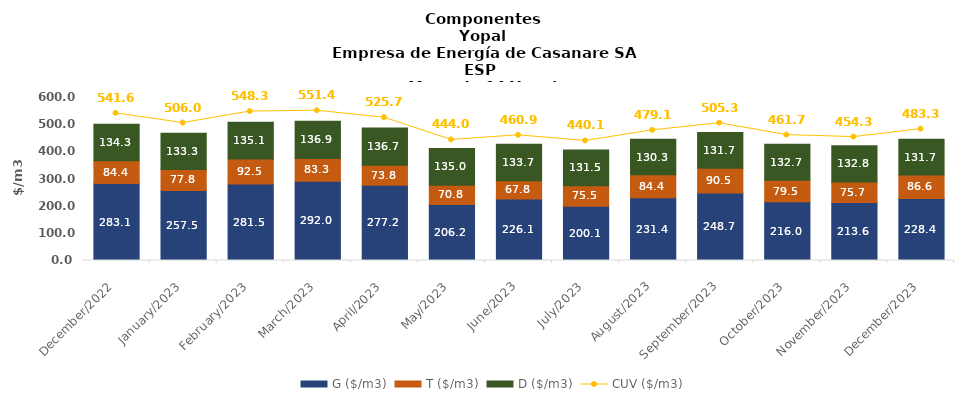
| Category | G ($/m3) | T ($/m3) | D ($/m3) |
|---|---|---|---|
| 2022-12-01 | 283.07 | 84.41 | 134.3 |
| 2023-01-01 | 257.508 | 77.815 | 133.258 |
| 2023-02-01 | 281.451 | 92.545 | 135.074 |
| 2023-03-01 | 292.028 | 83.345 | 136.946 |
| 2023-04-01 | 277.158 | 73.848 | 136.749 |
| 2023-05-01 | 206.218 | 70.832 | 134.954 |
| 2023-06-01 | 226.097 | 67.766 | 133.705 |
| 2023-07-01 | 200.103 | 75.481 | 131.466 |
| 2023-08-01 | 231.393 | 84.415 | 130.283 |
| 2023-09-01 | 248.694 | 90.492 | 131.705 |
| 2023-10-01 | 216.024 | 79.542 | 132.704 |
| 2023-11-01 | 213.555 | 75.682 | 132.796 |
| 2023-12-01 | 228.438 | 86.567 | 131.735 |